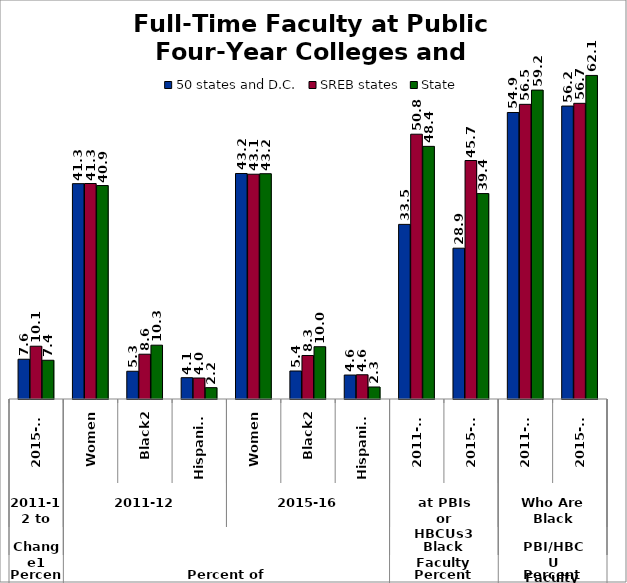
| Category | 50 states and D.C. | SREB states | State |
|---|---|---|---|
| 0 | 7.624 | 10.12 | 7.43 |
| 1 | 41.297 | 41.326 | 40.937 |
| 2 | 5.319 | 8.589 | 10.321 |
| 3 | 4.087 | 4.024 | 2.174 |
| 4 | 43.247 | 43.109 | 43.205 |
| 5 | 5.37 | 8.344 | 10.025 |
| 6 | 4.595 | 4.649 | 2.302 |
| 7 | 33.489 | 50.782 | 48.45 |
| 8 | 28.92 | 45.739 | 39.398 |
| 9 | 54.946 | 56.511 | 59.242 |
| 10 | 56.182 | 56.707 | 62.055 |